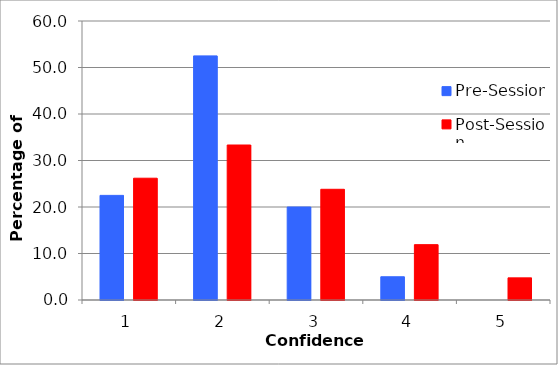
| Category | Pre-Session | Post-Session |
|---|---|---|
| 1.0 | 22.5 | 26.19 |
| 2.0 | 52.5 | 33.333 |
| 3.0 | 20 | 23.81 |
| 4.0 | 5 | 11.905 |
| 5.0 | 0 | 4.762 |